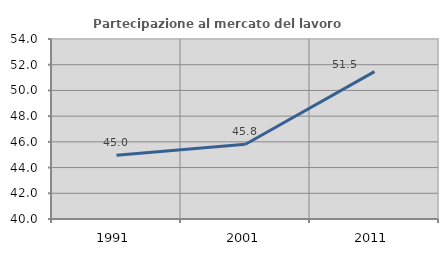
| Category | Partecipazione al mercato del lavoro  femminile |
|---|---|
| 1991.0 | 44.965 |
| 2001.0 | 45.814 |
| 2011.0 | 51.464 |